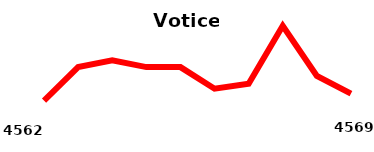
| Category | Votice |
|---|---|
| 2010 | 4562 |
| 2011 | 4596 |
| 2012 | 4603 |
| 2013 | 4596 |
| 2014 | 4596 |
| 2015 | 4574 |
| 2016 | 4579 |
| 2017 | 4638 |
| 2018 | 4587 |
| 2019 | 4569 |